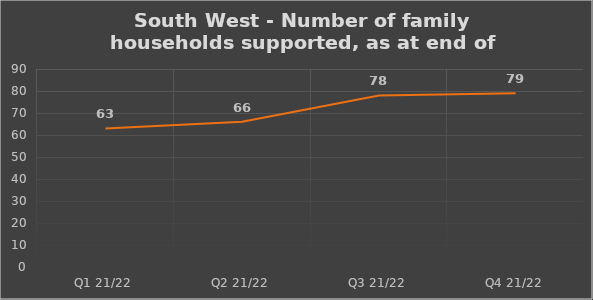
| Category | Number of financially supported households at end of quarter |
|---|---|
| Q1 21/22 | 63 |
| Q2 21/22 | 66 |
| Q3 21/22 | 78 |
| Q4 21/22 | 79 |